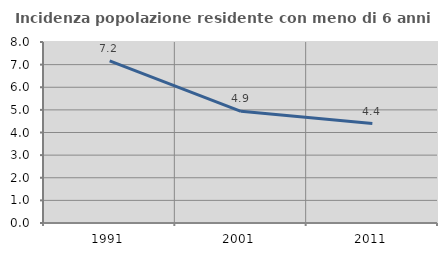
| Category | Incidenza popolazione residente con meno di 6 anni |
|---|---|
| 1991.0 | 7.164 |
| 2001.0 | 4.937 |
| 2011.0 | 4.397 |